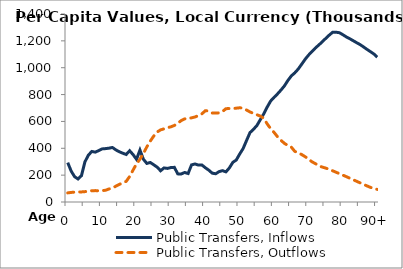
| Category | Public Transfers, Inflows | Public Transfers, Outflows |
|---|---|---|
| 0 | 293167.92 | 67690.796 |
|  | 230532.72 | 71282.009 |
| 2 | 188433.44 | 73542.762 |
| 3 | 171443.33 | 74561.882 |
| 4 | 196109 | 75069.946 |
| 5 | 298888.28 | 77143.334 |
| 6 | 348819.28 | 79712.048 |
| 7 | 376463.03 | 83833.61 |
| 8 | 371251.38 | 84837.249 |
| 9 | 382519.49 | 83675.646 |
| 10 | 395387.65 | 84552.304 |
| 11 | 397574.55 | 87429.939 |
| 12 | 400758.21 | 97142.242 |
| 13 | 406027.11 | 103058.65 |
| 14 | 388005.24 | 118051.11 |
| 15 | 374112.1 | 130880.7 |
| 16 | 363356.05 | 143245.1 |
| 17 | 353848.53 | 153609.74 |
| 18 | 381597.78 | 189719.5 |
| 19 | 353121.51 | 237581.66 |
| 20 | 318008.41 | 284358.1 |
| 21 | 386650.22 | 318774.98 |
| 22 | 318541.59 | 360196.75 |
| 23 | 287221.23 | 410580.3 |
| 24 | 294303.86 | 453162.34 |
| 25 | 277252.28 | 490837.43 |
| 26 | 259455.28 | 521098.34 |
| 27 | 232730.83 | 537233.36 |
| 28 | 253806.09 | 544793.11 |
| 29 | 250052.79 | 553683.66 |
| 30 | 256686.39 | 559971.01 |
| 31 | 258043.63 | 569884.57 |
| 32 | 209417.59 | 587130.16 |
| 33 | 208814.22 | 606228.64 |
| 34 | 219939.8 | 618785.63 |
| 35 | 212025.46 | 623103.59 |
| 36 | 276287.42 | 626631.93 |
| 37 | 283193.95 | 633150.05 |
| 38 | 274763.37 | 643434.02 |
| 39 | 275695.35 | 656209.68 |
| 40 | 255288.06 | 679678.35 |
| 41 | 237278.56 | 677790.2 |
| 42 | 215092.16 | 662712.13 |
| 43 | 210102.25 | 663113.2 |
| 44 | 226225.14 | 663387.14 |
| 45 | 233423.11 | 673715.53 |
| 46 | 224436.14 | 694855.01 |
| 47 | 253830.22 | 696235.38 |
| 48 | 295333.92 | 695952.57 |
| 49 | 312614.78 | 698764.96 |
| 50 | 357393.54 | 701626.74 |
| 51 | 398440.27 | 699265 |
| 52 | 458433.06 | 684866.26 |
| 53 | 516985.95 | 670622.23 |
| 54 | 541132.07 | 660019.32 |
| 55 | 569604.45 | 649878.13 |
| 56 | 613479.27 | 639640.5 |
| 57 | 656358.78 | 622905.66 |
| 58 | 707321.19 | 581341.38 |
| 59 | 752011.49 | 545732.48 |
| 60 | 779744.77 | 518042.4 |
| 61 | 805258 | 485793.09 |
| 62 | 833485.46 | 459639.28 |
| 63 | 864622.08 | 436457.03 |
| 64 | 904433.78 | 421375.47 |
| 65 | 938992.45 | 408794.89 |
| 66 | 961231.48 | 377654.47 |
| 67 | 989613.55 | 366057 |
| 68 | 1025157.3 | 353653.26 |
| 69 | 1061703.7 | 337848.3 |
| 70 | 1093549.3 | 320153.18 |
| 71 | 1119711.1 | 299471.46 |
| 72 | 1146740.8 | 285895.35 |
| 73 | 1169038 | 269791.14 |
| 74 | 1193215.2 | 259981.2 |
| 75 | 1217834.4 | 252554.98 |
| 76 | 1241788.7 | 243553.22 |
| 77 | 1263561.2 | 232664.39 |
| 78 | 1264274.8 | 221827.83 |
| 79 | 1260551.4 | 210791.79 |
| 80 | 1245581.7 | 199992.86 |
| 81 | 1229304.7 | 188891.86 |
| 82 | 1215915.8 | 177349.33 |
| 83 | 1201071.4 | 165735.21 |
| 84 | 1186393.4 | 154167.31 |
| 85 | 1172237 | 142606.2 |
| 86 | 1154801 | 131180.42 |
| 87 | 1136672.2 | 119970.98 |
| 88 | 1119909.7 | 108910.69 |
| 89 | 1102324.4 | 100274.33 |
| 90+ | 1078180.1 | 93809.387 |